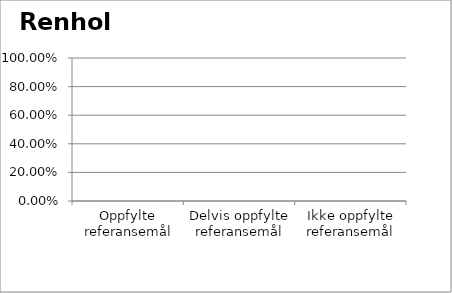
| Category | Renhold |
|---|---|
| Oppfylte referansemål | 0 |
| Delvis oppfylte referansemål | 0 |
| Ikke oppfylte referansemål | 0 |